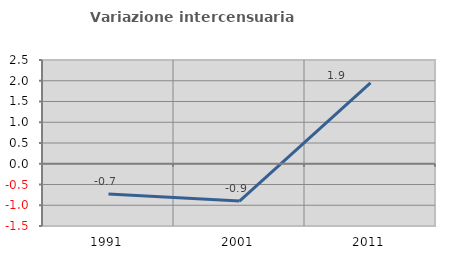
| Category | Variazione intercensuaria annua |
|---|---|
| 1991.0 | -0.727 |
| 2001.0 | -0.9 |
| 2011.0 | 1.95 |